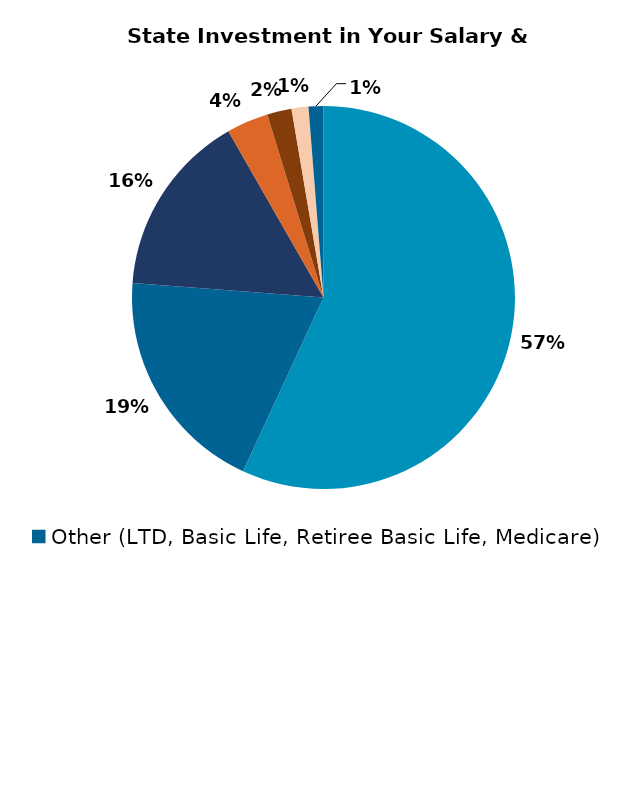
| Category | Series 0 |
|---|---|
| Salary | 1500 |
| Medical Insurance | 509 |
| Pension* | 408.9 |
| Social Security** | 93 |
| Retiree Medical Insurance | 54.6 |
| MO Deferred Compensation Match*** | 37.5 |
| Other (LTD, Basic Life, Retiree Basic Life, Medicare) | 33.03 |